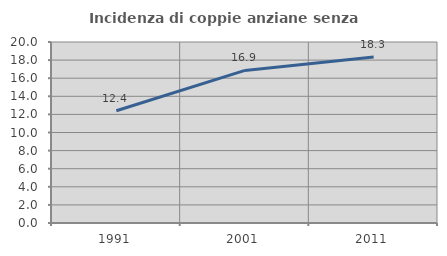
| Category | Incidenza di coppie anziane senza figli  |
|---|---|
| 1991.0 | 12.405 |
| 2001.0 | 16.861 |
| 2011.0 | 18.342 |